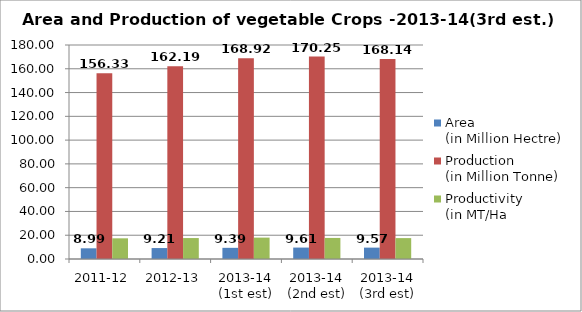
| Category | Area
(in Million Hectre) | Production
(in Million Tonne) | Productivity
(in MT/Ha |
|---|---|---|---|
| 2011-12 | 8.989 | 156.325 | 17.39 |
| 2012-13 | 9.205 | 162.187 | 17.619 |
| 2013-14
(1st est) | 9.39 | 168.919 | 17.989 |
| 2013-14
(2nd est) | 9.609 | 170.248 | 17.718 |
| 2013-14
(3rd est) | 9.567 | 168.142 | 17.575 |